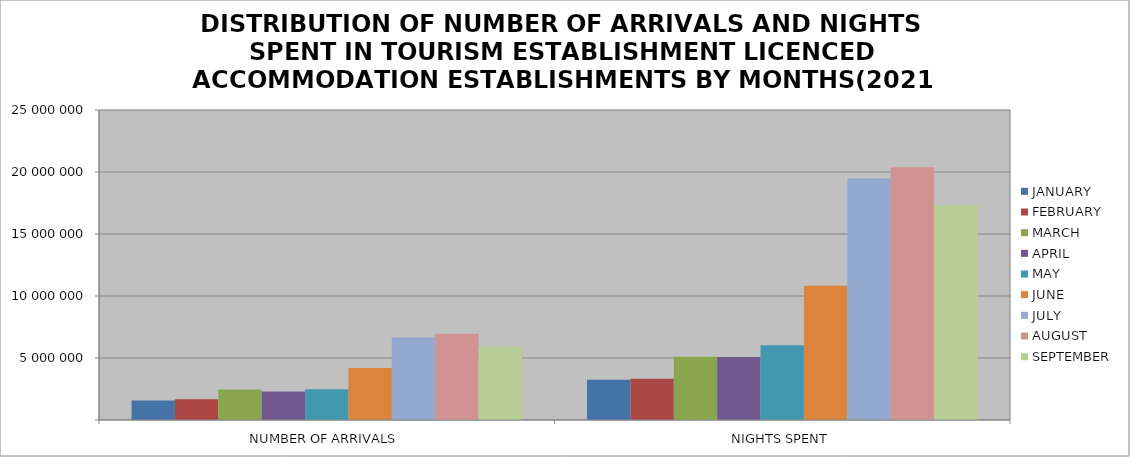
| Category | JANUARY | FEBRUARY | MARCH | APRIL | MAY | JUNE | JULY | AUGUST | SEPTEMBER |
|---|---|---|---|---|---|---|---|---|---|
| NUMBER OF ARRIVALS | 1571594 | 1670164 | 2462715 | 2305703 | 2480312 | 4203299 | 6647723 | 6953153 | 5925169 |
| NIGHTS SPENT | 3239980 | 3333484 | 5094921 | 5081446 | 6019981 | 10819754 | 19475865 | 20388962 | 17330893 |